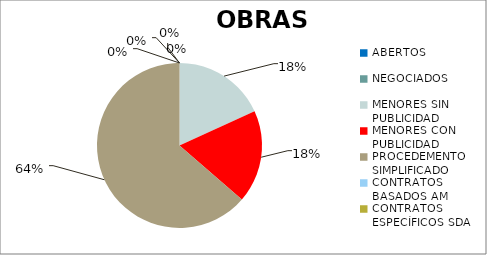
| Category | Series 0 |
|---|---|
| ABERTOS  | 0 |
| NEGOCIADOS  | 0 |
| MENORES SIN PUBLICIDAD | 0.182 |
| MENORES CON PUBLICIDAD | 0.182 |
| PROCEDEMENTO SIMPLIFICADO | 0.636 |
| CONTRATOS BASADOS AM | 0 |
| CONTRATOS ESPECÍFICOS SDA | 0 |